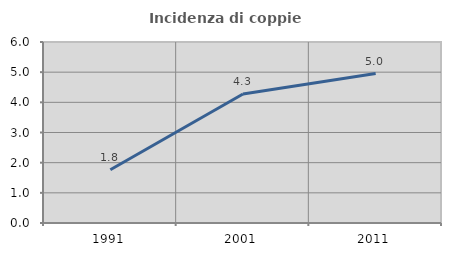
| Category | Incidenza di coppie miste |
|---|---|
| 1991.0 | 1.766 |
| 2001.0 | 4.277 |
| 2011.0 | 4.956 |